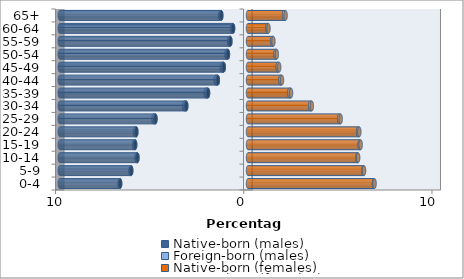
| Category | Native-born (males) | Foreign-born (males) | Native-born (females) | Foreign-born (females) |
|---|---|---|---|---|
| 0-4 | -6.793 | -0.037 | 6.691 | 0.033 |
| 5-9 | -6.203 | -0.044 | 6.126 | 0.04 |
| 10-14 | -5.874 | -0.048 | 5.808 | 0.044 |
| 15-19 | -5.994 | -0.061 | 5.932 | 0.054 |
| 20-24 | -5.931 | -0.08 | 5.847 | 0.067 |
| 25-29 | -4.916 | -0.103 | 4.842 | 0.08 |
| 30-34 | -3.279 | -0.12 | 3.305 | 0.087 |
| 35-39 | -2.123 | -0.124 | 2.199 | 0.088 |
| 40-44 | -1.602 | -0.118 | 1.721 | 0.085 |
| 45-49 | -1.289 | -0.106 | 1.578 | 0.079 |
| 50-54 | -1.065 | -0.088 | 1.459 | 0.071 |
| 55-59 | -0.936 | -0.067 | 1.288 | 0.061 |
| 60-64 | -0.792 | -0.053 | 1.031 | 0.058 |
| 65+ | -1.418 | -0.064 | 1.913 | 0.084 |